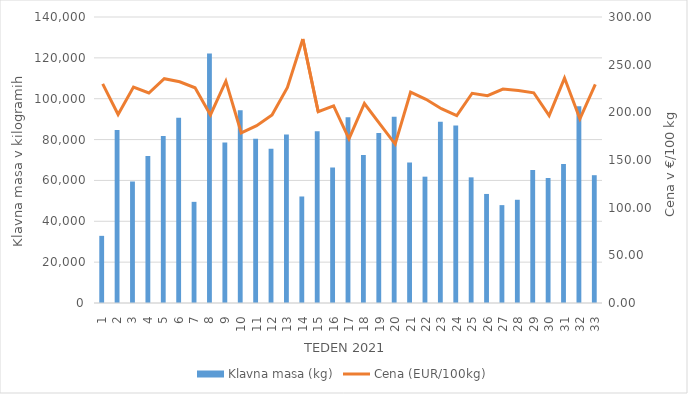
| Category | Klavna masa (kg) |
|---|---|
| 1.0 | 32871 |
| 2.0 | 84639 |
| 3.0 | 59476 |
| 4.0 | 72013 |
| 5.0 | 81759 |
| 6.0 | 90669 |
| 7.0 | 49517 |
| 8.0 | 122111 |
| 9.0 | 78545 |
| 10.0 | 94384 |
| 11.0 | 80405 |
| 12.0 | 75534 |
| 13.0 | 82440 |
| 14.0 | 52143 |
| 15.0 | 84105 |
| 16.0 | 66298 |
| 17.0 | 90925 |
| 18.0 | 72394 |
| 19.0 | 83193 |
| 20.0 | 91231 |
| 21.0 | 68763 |
| 22.0 | 61837 |
| 23.0 | 88747 |
| 24.0 | 86888 |
| 25.0 | 61507 |
| 26.0 | 53379 |
| 27.0 | 47910 |
| 28.0 | 50529 |
| 29.0 | 65062 |
| 30.0 | 61178 |
| 31.0 | 67992 |
| 32.0 | 96308 |
| 33.0 | 62558 |